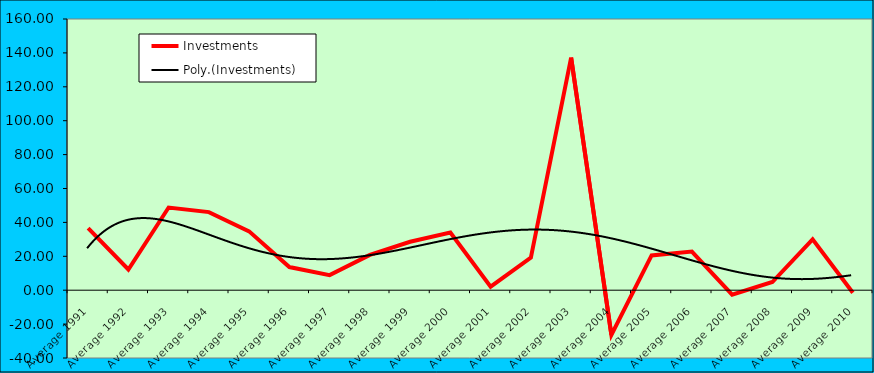
| Category | Investments |
|---|---|
| Average 1991 | 36.683 |
| Average 1992 | 12.209 |
| Average 1993 | 48.777 |
| Average 1994 | 46.063 |
| Average 1995 | 34.736 |
| Average 1996 | 13.672 |
| Average 1997 | 8.884 |
| Average 1998 | 20.857 |
| Average 1999 | 28.594 |
| Average 2000 | 34.046 |
| Average 2001 | 2.088 |
| Average 2002 | 19.247 |
| Average 2003 | 137.214 |
| Average 2004 | -26.351 |
| Average 2005 | 20.491 |
| Average 2006 | 22.753 |
| Average 2007 | -2.64 |
| Average 2008 | 4.831 |
| Average 2009 | 29.968 |
| Average 2010 | -1.487 |